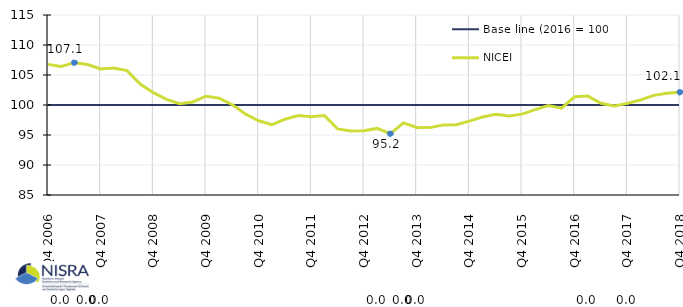
| Category | Base line (2016 = 100) | NICEI | Max, Min & Latest Q |
|---|---|---|---|
| Q4 2006 | 100 | 106.773 | 0 |
|  | 100 | 106.439 | 0 |
|  | 100 | 107.054 | 107.054 |
|  | 100 | 106.755 | 0 |
| Q4 2007 | 100 | 105.997 | 0 |
|  | 100 | 106.165 | 0 |
|  | 100 | 105.73 | 0 |
|  | 100 | 103.503 | 0 |
| Q4 2008 | 100 | 102.055 | 0 |
|  | 100 | 100.941 | 0 |
|  | 100 | 100.229 | 0 |
|  | 100 | 100.505 | 0 |
| Q4 2009 | 100 | 101.469 | 0 |
|  | 100 | 101.153 | 0 |
|  | 100 | 100.041 | 0 |
|  | 100 | 98.492 | 0 |
| Q4 2010 | 100 | 97.368 | 0 |
|  | 100 | 96.703 | 0 |
|  | 100 | 97.633 | 0 |
|  | 100 | 98.253 | 0 |
| Q4 2011 | 100 | 98.057 | 0 |
|  | 100 | 98.23 | 0 |
|  | 100 | 96.007 | 0 |
|  | 100 | 95.656 | 0 |
| Q4 2012 | 100 | 95.704 | 0 |
|  | 100 | 96.1 | 0 |
|  | 100 | 95.214 | 95.214 |
|  | 100 | 97.01 | 0 |
| Q4 2013 | 100 | 96.264 | 0 |
|  | 100 | 96.231 | 0 |
|  | 100 | 96.653 | 0 |
|  | 100 | 96.721 | 0 |
| Q4 2014 | 100 | 97.317 | 0 |
|  | 100 | 97.999 | 0 |
|  | 100 | 98.441 | 0 |
|  | 100 | 98.151 | 0 |
| Q4 2015 | 100 | 98.48 | 0 |
|  | 100 | 99.241 | 0 |
|  | 100 | 99.915 | 0 |
|  | 100 | 99.469 | 0 |
| Q4 2016 | 100 | 101.376 | 0 |
|  | 100 | 101.479 | 0 |
|  | 100 | 100.284 | 0 |
|  | 100 | 99.85 | 0 |
| Q4 2017 | 100 | 100.274 | 0 |
|  | 100 | 100.841 | 0 |
|  | 100 | 101.602 | 0 |
|  | 100 | 101.962 | 0 |
| Q4 2018 | 100 | 102.137 | 102.137 |